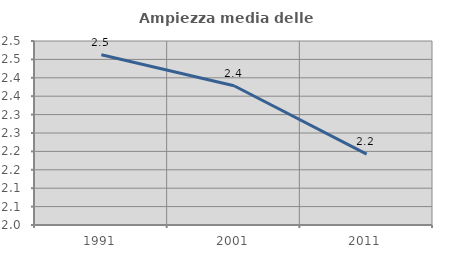
| Category | Ampiezza media delle famiglie |
|---|---|
| 1991.0 | 2.463 |
| 2001.0 | 2.378 |
| 2011.0 | 2.193 |